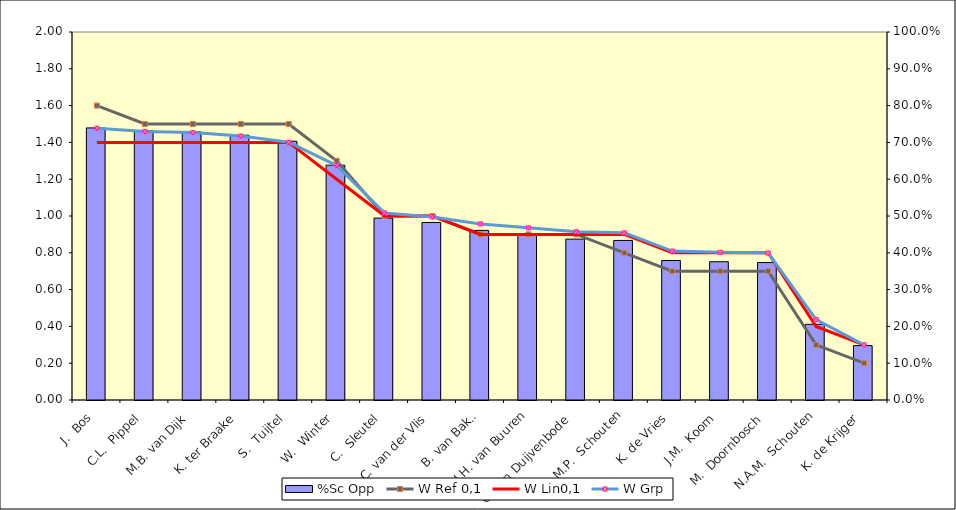
| Category | %Sc Opp |
|---|---|
| J.  Bos | 0.739 |
| C.L.  Pippel | 0.732 |
| M.B. van Dijk | 0.729 |
| K. ter Braake | 0.72 |
| S.  Tuijtel | 0.703 |
| W.  Winter | 0.638 |
| C.  Sleutel | 0.494 |
| C. van der Vlis | 0.482 |
| B. van Bakel | 0.461 |
| J.H. van Buuren | 0.449 |
| C. van Duijvenbode | 0.437 |
| J.M.P.  Schouten | 0.434 |
| K. de Vries | 0.379 |
| J.M.  Koorn | 0.376 |
| M.  Doornbosch | 0.374 |
| N.A.M.  Schouten | 0.206 |
| K. de Krijger | 0.148 |